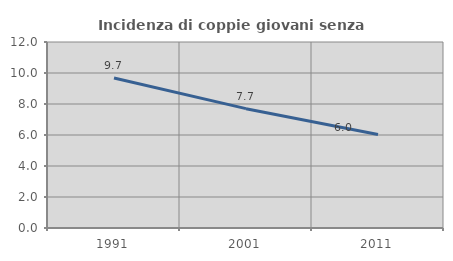
| Category | Incidenza di coppie giovani senza figli |
|---|---|
| 1991.0 | 9.676 |
| 2001.0 | 7.699 |
| 2011.0 | 6.031 |